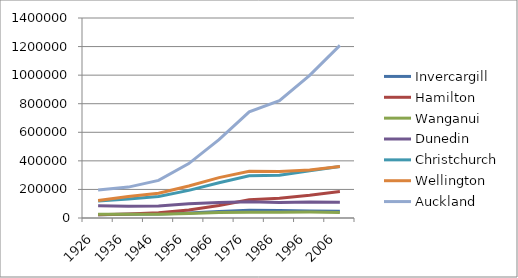
| Category | Invercargill | Hamilton | Wanganui | Dunedin | Christchurch | Wellington | Auckland |
|---|---|---|---|---|---|---|---|
| 1926.0 | 21956.727 | 23173.817 | 26834.791 | 85266.677 | 118785.62 | 122168.875 | 196636.666 |
| 1936.0 | 25883.669 | 28219.88 | 26490.755 | 82118.634 | 132981.75 | 151015.366 | 216183.559 |
| 1946.0 | 27583 | 36937.74 | 26462 | 83351 | 150047 | 173520 | 263370 |
| 1956.0 | 35107 | 56204.03 | 32100 | 99370 | 193367 | 224350 | 381063 |
| 1966.0 | 46016 | 87749.795 | 38174 | 108734 | 247248 | 282487 | 548293 |
| 1976.0 | 53762 | 127306.725 | 39679 | 113222 | 295296 | 327414 | 742786 |
| 1986.0 | 52807 | 138645 | 40758 | 108864 | 299373 | 325697 | 820754 |
| 1996.0 | 49306 | 159234 | 41320 | 112279 | 331443 | 335468 | 997940 |
| 2006.0 | 46773 | 184908 | 38988 | 110997 | 360768 | 360624 | 1208094 |